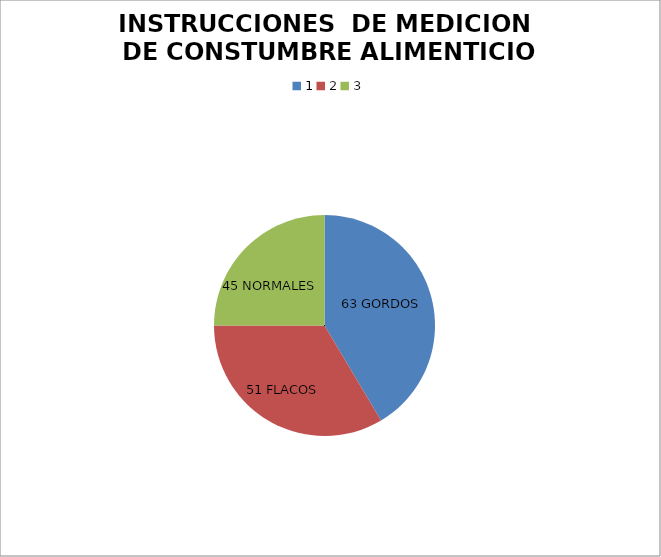
| Category | Series 0 |
|---|---|
| 0 | 63 |
| 1 | 51 |
| 2 | 38 |